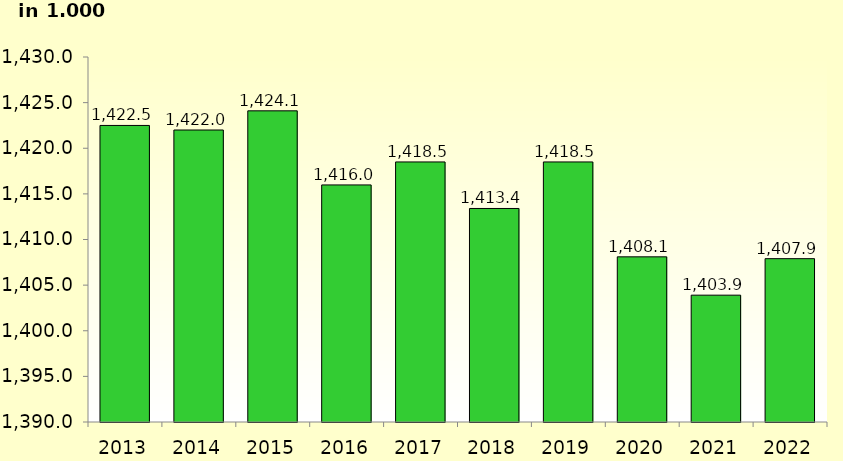
| Category | Series 1 |
|---|---|
| 2013.0 | 1422.5 |
| 2014.0 | 1422 |
| 2015.0 | 1424.1 |
| 2016.0 | 1415.98 |
| 2017.0 | 1418.5 |
| 2018.0 | 1413.4 |
| 2019.0 | 1418.5 |
| 2020.0 | 1408.1 |
| 2021.0 | 1403.9 |
| 2022.0 | 1407.9 |